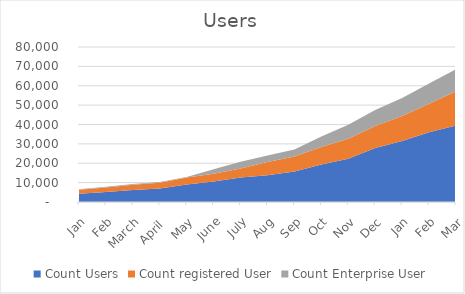
| Category | Count Users | Count registered User | Count Enterprise User |
|---|---|---|---|
|  Jan  | 4295 | 1988 | 290 |
|  Feb  | 5194 | 2352 | 290 |
|  March  | 6226 | 2673 | 345 |
|  April   | 6944 | 3013 | 355 |
|  May  | 8993 | 3599 | 365 |
|  June  | 10554 | 4038 | 2365 |
|  July  | 12593 | 4756 | 3375 |
|  Aug  | 13848 | 6820 | 3395 |
|  Sep  | 15720 | 7790 | 3595 |
|  Oct  | 19370 | 9079 | 5365 |
|  Nov  | 22339 | 10242 | 7265 |
|  Dec  | 27841 | 11387 | 8265 |
|  Jan  | 31519 | 12887 | 9265 |
|  Feb  | 36012 | 14703 | 10465 |
|  Mar  | 39421 | 17704 | 11465 |